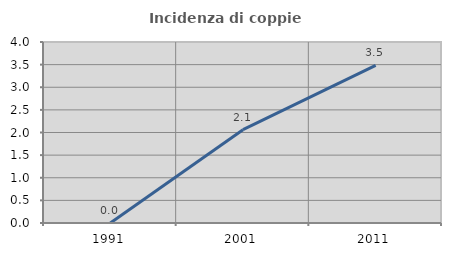
| Category | Incidenza di coppie miste |
|---|---|
| 1991.0 | 0 |
| 2001.0 | 2.062 |
| 2011.0 | 3.483 |